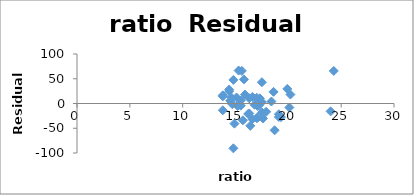
| Category | Series 0 |
|---|---|
| 17.2 | -2.068 |
| 17.6 | -30.212 |
| 19.3 | -27.625 |
| 17.1 | -28.86 |
| 24.0 | -15.848 |
| 18.4 | 4.03 |
| 14.4 | 28.164 |
| 16.6 | 13.32 |
| 19.1 | -27.227 |
| 16.3 | -20.17 |
| 17.9 | -16.755 |
| 19.1 | -21.751 |
| 17.3 | 10.519 |
| 17.5 | -18.337 |
| 15.8 | 48.733 |
| 15.1 | 12.179 |
| 17.0 | -29.526 |
| 16.8 | -2.531 |
| 13.8 | 16.495 |
| 17.0 | 11.596 |
| 14.8 | 47.688 |
| 20.1 | -8.007 |
| 17.5 | 42.937 |
| 17.5 | 2.937 |
| 15.5 | 6.237 |
| 16.3 | 10.549 |
| 14.5 | 5.587 |
| 18.7 | -54.149 |
| 15.6 | 65.865 |
| 13.8 | -13.748 |
| 17.2 | -3.82 |
| 15.2 | -4.88 |
| 16.2 | -21.083 |
| 15.3 | 66.571 |
| 16.6 | -31.783 |
| 15.5 | -4.42 |
| 19.9 | 29.408 |
| 17.1 | -5.312 |
| 14.7 | -1.424 |
| 16.4 | -45.076 |
| 14.4 | 24.855 |
| 18.6 | 23.516 |
| 15.7 | -34.005 |
| 24.3 | 65.766 |
| 13.8 | 14.433 |
| 14.6 | 12.293 |
| 20.2 | 18.085 |
| 14.8 | -90.531 |
| 15.9 | 18.043 |
| 14.9 | -40.657 |